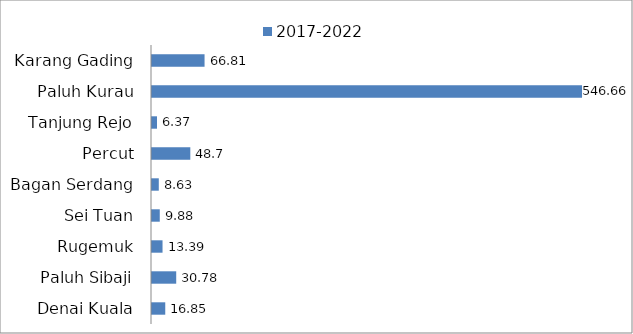
| Category | 2017-2022 |
|---|---|
| Denai Kuala | 16.85 |
| Paluh Sibaji | 30.78 |
| Rugemuk | 13.39 |
| Sei Tuan | 9.88 |
| Bagan Serdang | 8.63 |
| Percut | 48.7 |
| Tanjung Rejo | 6.37 |
| Paluh Kurau | 546.66 |
| Karang Gading | 66.81 |